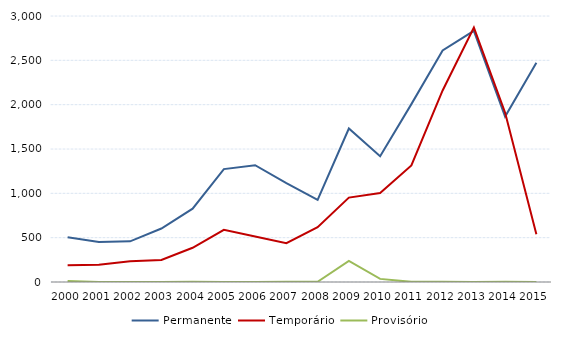
| Category | Permanente | Temporário | Provisório |
|---|---|---|---|
| 2000.0 | 505 | 188 | 11 |
| 2001.0 | 450 | 194 | 0 |
| 2002.0 | 459 | 234 | 0 |
| 2003.0 | 603 | 249 | 0 |
| 2004.0 | 827 | 386 | 4 |
| 2005.0 | 1273 | 588 | 1 |
| 2006.0 | 1317 | 514 | 0 |
| 2007.0 | 1114 | 438 | 4 |
| 2008.0 | 927 | 618 | 3 |
| 2009.0 | 1731 | 952 | 239 |
| 2010.0 | 1419 | 1004 | 35 |
| 2011.0 | 2006 | 1315 | 2 |
| 2012.0 | 2611 | 2160 | 3 |
| 2013.0 | 2833 | 2871 | 0 |
| 2014.0 | 1866 | 1909 | 4 |
| 2015.0 | 2474 | 539 | 0 |